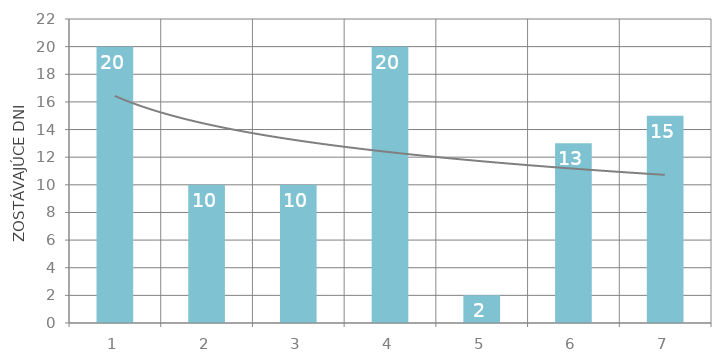
| Category | Celková hodnota |
|---|---|
| 1 | 20 |
| 2 | 10 |
| 3 | 10 |
| 4 | 20 |
| 5 | 2 |
| 6 | 13 |
| 7 | 15 |